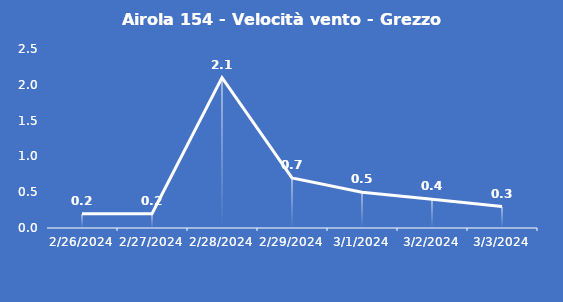
| Category | Airola 154 - Velocità vento - Grezzo (m/s) |
|---|---|
| 2/26/24 | 0.2 |
| 2/27/24 | 0.2 |
| 2/28/24 | 2.1 |
| 2/29/24 | 0.7 |
| 3/1/24 | 0.5 |
| 3/2/24 | 0.4 |
| 3/3/24 | 0.3 |